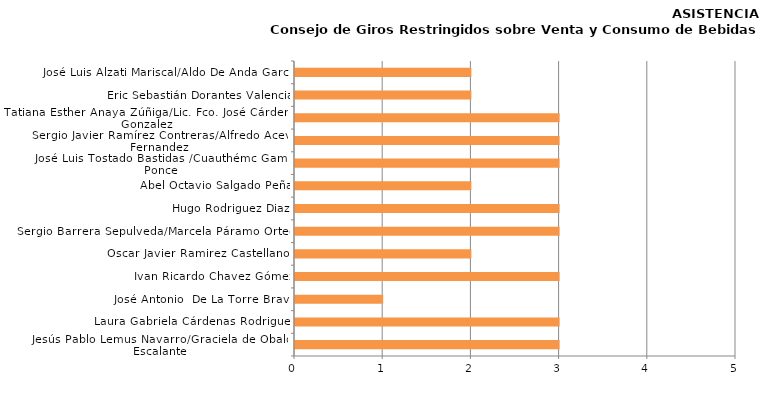
| Category | Series 0 |
|---|---|
| Jesús Pablo Lemus Navarro/Graciela de Obaldía Escalante | 3 |
| Laura Gabriela Cárdenas Rodriguez | 3 |
| José Antonio  De La Torre Bravo | 1 |
| Ivan Ricardo Chavez Gómez | 3 |
| Oscar Javier Ramirez Castellanos | 2 |
| Sergio Barrera Sepulveda/Marcela Páramo Ortega | 3 |
| Hugo Rodriguez Diaz | 3 |
| Abel Octavio Salgado Peña | 2 |
| José Luis Tostado Bastidas /Cuauthémc Gamez Ponce | 3 |
| Sergio Javier Ramírez Contreras/Alfredo Aceves Fernandez | 3 |
| Tatiana Esther Anaya Zúñiga/Lic. Fco. José Cárdenas Gonzalez | 3 |
| Eric Sebastián Dorantes Valencia | 2 |
| José Luis Alzati Mariscal/Aldo De Anda García | 2 |